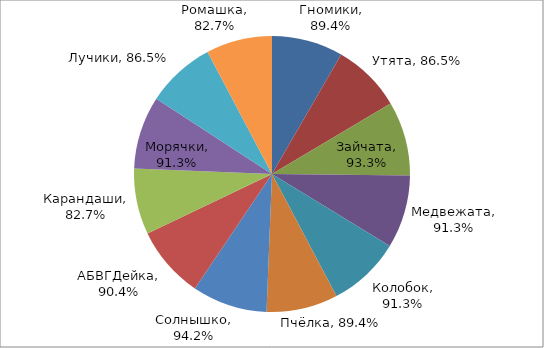
| Category | Series 0 |
|---|---|
| Гномики | 0.894 |
| Утята | 0.865 |
| Зайчата | 0.933 |
| Медвежата | 0.913 |
| Колобок | 0.913 |
| Пчёлка | 0.894 |
| Солнышко | 0.942 |
| АБВГДейка | 0.904 |
| Карандаши | 0.827 |
| Морячки | 0.913 |
| Лучики | 0.865 |
| Ромашка | 0.827 |